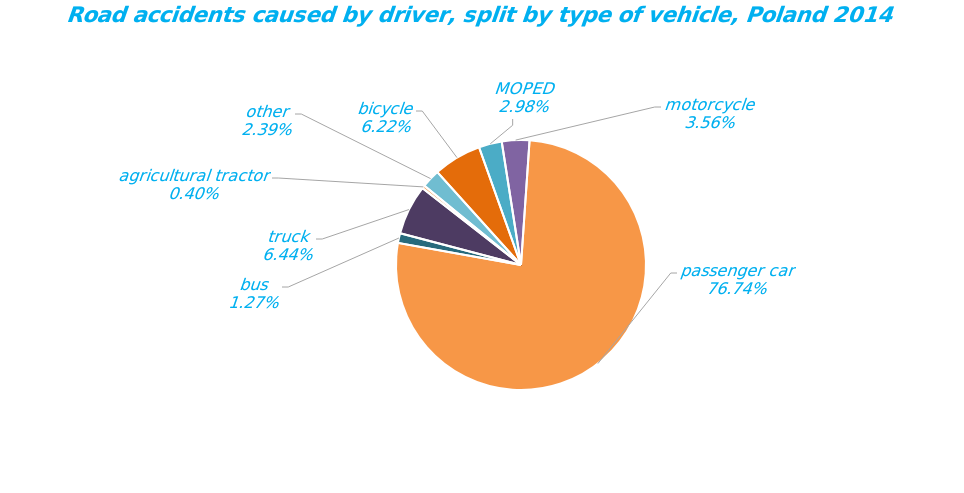
| Category | Series 0 |
|---|---|
| bicycle | 1786 |
| MOPED | 855 |
| motorcycle | 1023 |
| passenger car | 22036 |
| bus | 364 |
| truck | 1850 |
| agricultural tractor | 115 |
| other | 687 |